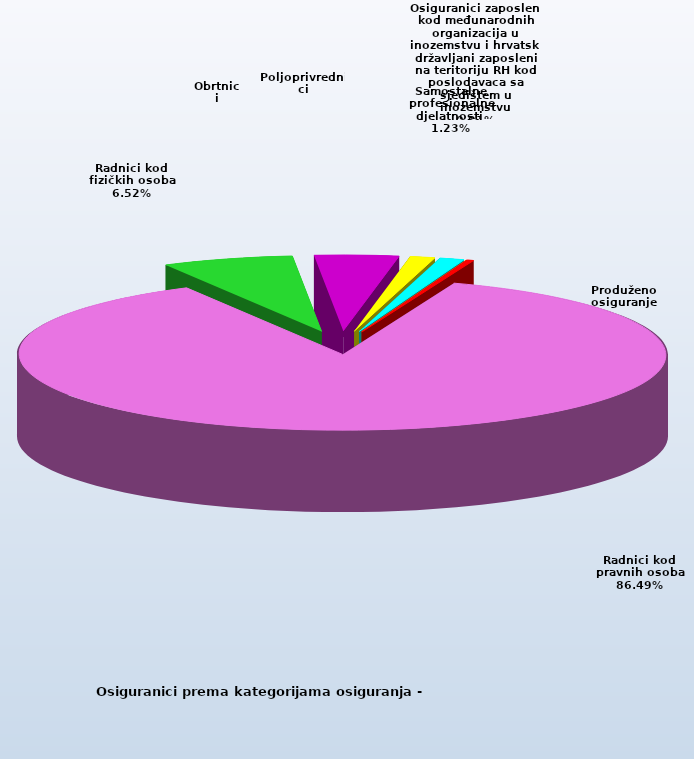
| Category | Series 0 |
|---|---|
| Radnici kod pravnih osoba | 1333993 |
| Radnici kod fizičkih osoba | 100534 |
| Obrtnici | 64464 |
| Poljoprivrednici | 19196 |
| Samostalne profesionalne djelatnosti  | 18970 |
| Osiguranici zaposleni kod međunarodnih organizacija u inozemstvu i hrvatski državljani zaposleni na teritoriju RH kod poslodavaca sa sjedištem u inozemstvu | 83 |
| Produženo osiguranje | 5088 |